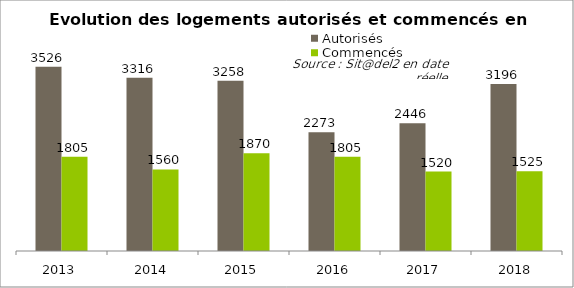
| Category | Autorisés | Commencés |
|---|---|---|
| 2013 | 3526 | 1805 |
| 2014 | 3316 | 1560 |
| 2015 | 3258 | 1870 |
| 2016 | 2273 | 1805 |
| 2017 | 2446 | 1520 |
| 2018 | 3196 | 1525 |